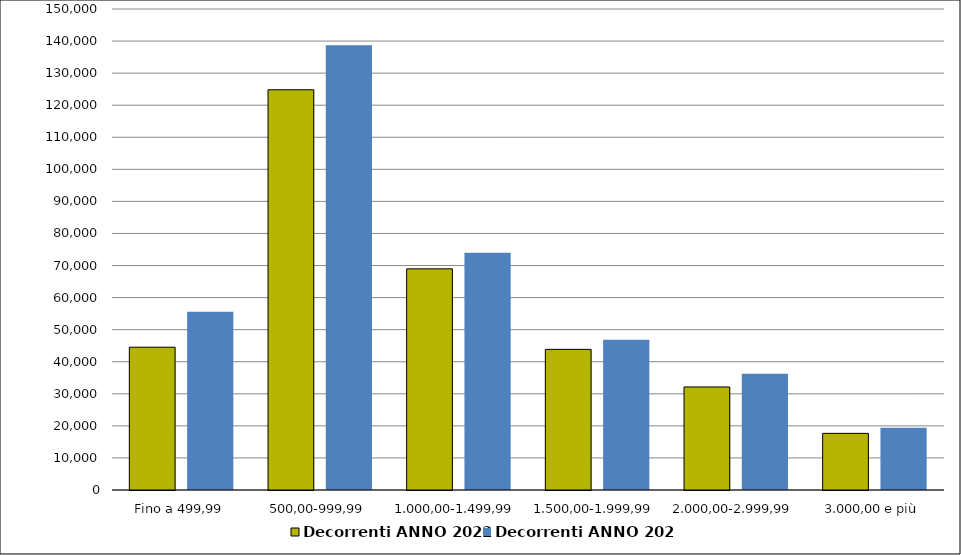
| Category | Decorrenti ANNO 2022 | Decorrenti ANNO 2021 |
|---|---|---|
|  Fino a 499,99  | 44531 | 55602 |
|  500,00-999,99  | 124816 | 138674 |
|  1.000,00-1.499,99  | 68965 | 73984 |
|  1.500,00-1.999,99  | 43855 | 46856 |
|  2.000,00-2.999,99  | 32131 | 36283 |
|  3.000,00 e più  | 17661 | 19438 |